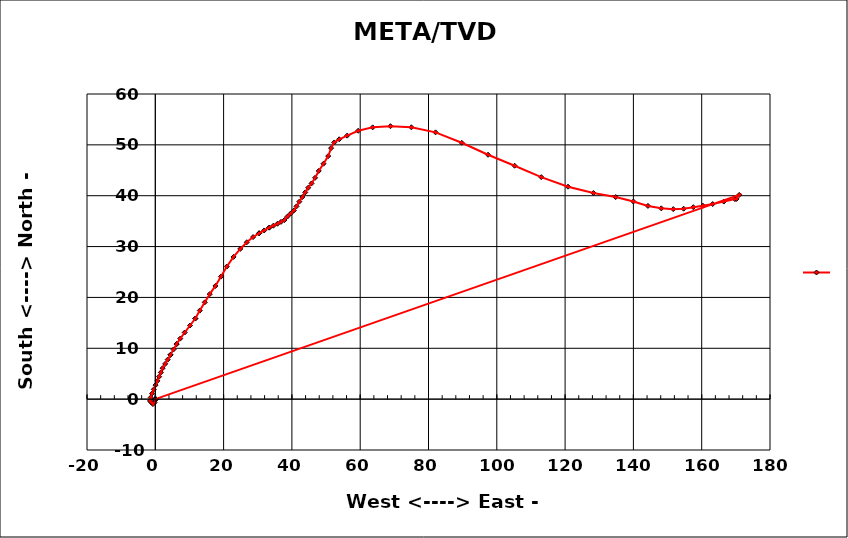
| Category | Series 0 |
|---|---|
| 0.0 | 0 |
| 0.0 | 0 |
| 0.013965185908719738 | -0.006 |
| 0.027930371817439476 | -0.012 |
| 0.041895557726159216 | -0.017 |
| 0.05586074363487896 | -0.023 |
| 0.0698259295435987 | -0.029 |
| 0.08379111545231845 | -0.035 |
| 0.09775630136103819 | -0.04 |
| 0.11172148726975793 | -0.046 |
| -0.2058657351733637 | -0.683 |
| -0.702585359210208 | -0.97 |
| -1.1266549915286492 | -0.662 |
| -1.5507246238470904 | -0.354 |
| -1.3293430640074384 | 0.328 |
| -0.964270823102273 | 1.093 |
| -0.4439738167978182 | 1.926 |
| 0.07632318950663652 | 2.758 |
| 0.5966201958110913 | 3.591 |
| 1.116917202115546 | 4.423 |
| 1.6372142084200008 | 5.256 |
| 2.1575112147244555 | 6.089 |
| 2.8879303756338577 | 6.929 |
| 3.61834953654326 | 7.769 |
| 4.440369485261798 | 8.715 |
| 4.440369485261798 | 8.715 |
| 5.343174369826439 | 9.772 |
| 6.24597925439108 | 10.829 |
| 6.24597925439108 | 10.829 |
| 7.304229898974679 | 11.906 |
| 8.615191164608094 | 13.107 |
| 10.164916974648698 | 14.478 |
| 11.714642784689302 | 15.849 |
| 11.714642784689302 | 15.849 |
| 13.031951343151459 | 17.419 |
| 14.485911561799153 | 19.034 |
| 15.939871780446847 | 20.649 |
| 17.607116673360316 | 22.259 |
| 19.2316854145299 | 24.095 |
| 20.953943419207263 | 26.076 |
| 22.907445994144563 | 27.963 |
| 24.884707814833817 | 29.536 |
| 26.796738712763464 | 30.85 |
| 28.633137365498065 | 31.868 |
| 30.401749088444532 | 32.618 |
| 30.401749088444532 | 32.618 |
| 31.880734856752994 | 33.171 |
| 33.359720625061456 | 33.724 |
| 33.359720625061456 | 33.724 |
| 34.56484107338131 | 34.104 |
| 35.76996152170116 | 34.484 |
| 36.80578214063005 | 34.851 |
| 37.84160275955894 | 35.218 |
| 38.701570916138195 | 35.902 |
| 39.64351408773934 | 36.502 |
| 40.58545725934049 | 37.102 |
| 41.36309386191648 | 37.907 |
| 42.18225708942178 | 38.833 |
| 43.04560835332796 | 39.743 |
| 43.90895961723413 | 40.653 |
| 44.77231088114031 | 41.563 |
| 45.75884144203979 | 42.42 |
| 46.792233331551316 | 43.528 |
| 47.86090270063745 | 44.872 |
| 49.255174956063215 | 46.291 |
| 50.6328645244252 | 47.794 |
| 51.48060175141947 | 49.355 |
| 52.39655915575865 | 50.467 |
| 53.85248959425663 | 51.1 |
| 56.18951107819585 | 51.814 |
| 59.41858134395589 | 52.771 |
| 63.65588084225032 | 53.442 |
| 68.8607191515023 | 53.669 |
| 74.98193716470824 | 53.455 |
| 82.07164696107604 | 52.459 |
| 89.73413164183248 | 50.406 |
| 97.43159080145863 | 48.052 |
| 105.20813581257899 | 45.896 |
| 113.02274795172578 | 43.655 |
| 120.85814150887275 | 41.774 |
| 128.28981939554703 | 40.53 |
| 134.8079664830994 | 39.73 |
| 139.99734487529506 | 38.861 |
| 144.25320093071377 | 37.996 |
| 148.16857270360546 | 37.515 |
| 151.66543503568843 | 37.362 |
| 154.71109678437554 | 37.442 |
| 157.53103043686923 | 37.738 |
| 160.35096408936292 | 38.035 |
| 163.2206382457788 | 38.362 |
| 166.47576166213582 | 38.848 |
| 169.73088507849286 | 39.335 |
| 170.2011145672681 | 39.372 |
| 170.99193655458248 | 40.162 |
| 0.0 | 0 |